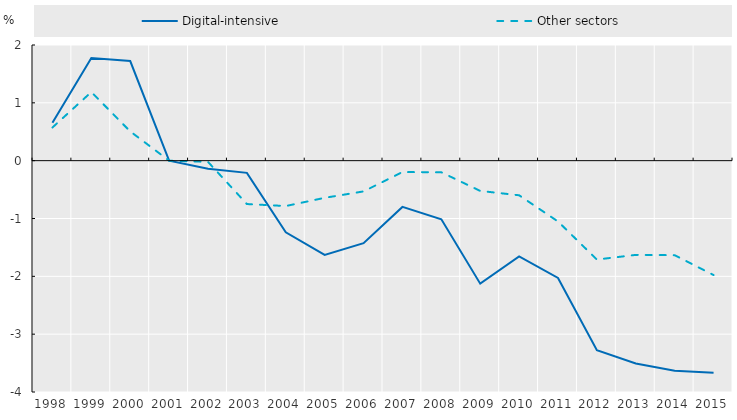
| Category | Digital-intensive | Other sectors |
|---|---|---|
| 1998.0 | 0.657 | 0.574 |
| 1999.0 | 1.774 | 1.186 |
| 2000.0 | 1.723 | 0.506 |
| 2001.0 | 0 | 0 |
| 2002.0 | -0.138 | -0.021 |
| 2003.0 | -0.211 | -0.75 |
| 2004.0 | -1.238 | -0.784 |
| 2005.0 | -1.629 | -0.643 |
| 2006.0 | -1.427 | -0.532 |
| 2007.0 | -0.8 | -0.196 |
| 2008.0 | -1.013 | -0.201 |
| 2009.0 | -2.127 | -0.523 |
| 2010.0 | -1.654 | -0.598 |
| 2011.0 | -2.029 | -1.052 |
| 2012.0 | -3.277 | -1.71 |
| 2013.0 | -3.506 | -1.629 |
| 2014.0 | -3.632 | -1.634 |
| 2015.0 | -3.668 | -1.978 |